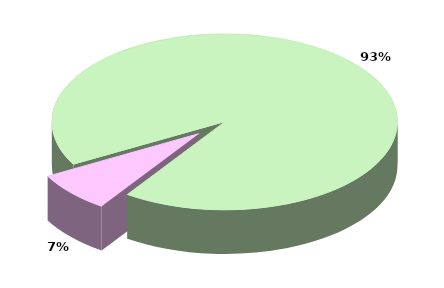
| Category | Series 0 |
|---|---|
| TOTALE ENTRATE CORRENTI | 22743.938 |
| TOTALE ENTRATE IN CONTO CAPITALE | 1824.549 |